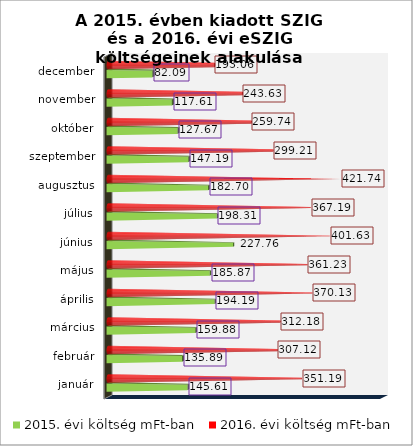
| Category | 2015. évi költség mFt-ban | 2016. évi költség mFt-ban |
|---|---|---|
| január | 145.612 | 351.186 |
| február | 135.893 | 307.123 |
| március | 159.883 | 312.181 |
| április | 194.191 | 370.133 |
| május | 185.869 | 361.226 |
| június | 227.759 | 401.629 |
| július | 198.31 | 367.194 |
| augusztus | 182.702 | 421.737 |
| szeptember | 147.194 | 299.208 |
| október | 127.665 | 259.741 |
| november | 117.611 | 243.634 |
| december | 82.092 | 193.059 |